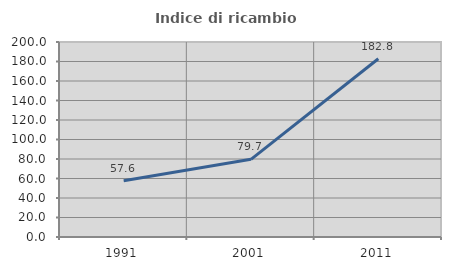
| Category | Indice di ricambio occupazionale  |
|---|---|
| 1991.0 | 57.635 |
| 2001.0 | 79.661 |
| 2011.0 | 182.828 |